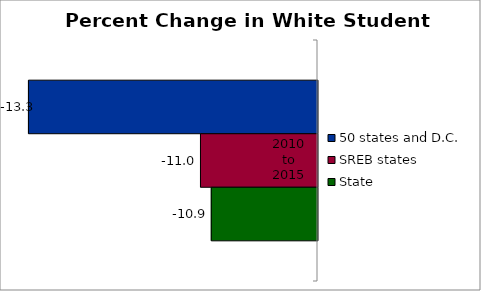
| Category | 50 states and D.C. | SREB states | State |
|---|---|---|---|
| 2010 to
2015 | -13.266 | -11.025 | -10.884 |